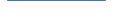
| Category | Series 0 |
|---|---|
| 0 | 13 |
| 1 | 15 |
| 2 | 18 |
| 3 | 13 |
| 4 | 16 |
| 5 | 9 |
| 6 | 7 |
| 7 | 11 |
| 8 | 9 |